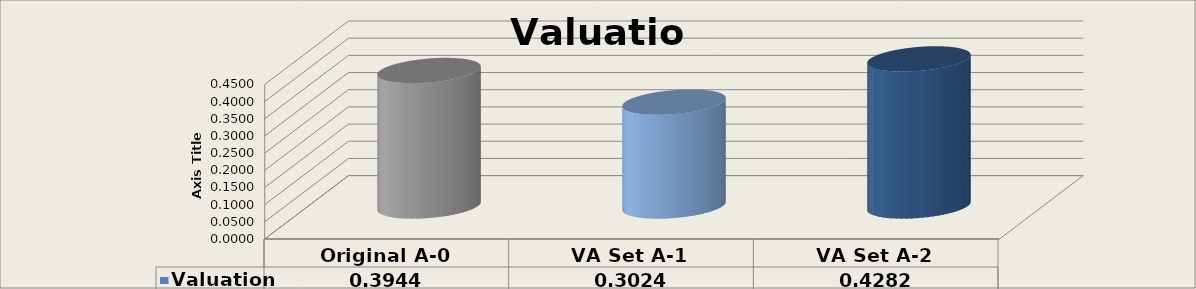
| Category | Valuation |
|---|---|
| Original A-0 | 0.394 |
| VA Set A-1 | 0.302 |
| VA Set A-2 | 0.428 |